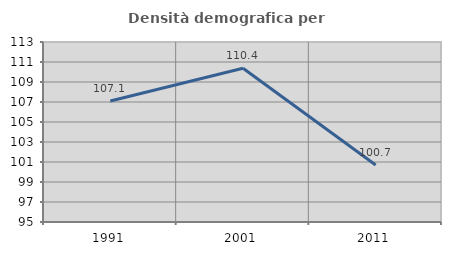
| Category | Densità demografica |
|---|---|
| 1991.0 | 107.095 |
| 2001.0 | 110.375 |
| 2011.0 | 100.699 |